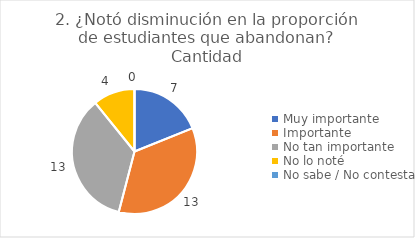
| Category | 2. ¿Notó disminución en la proporción de estudiantes que abandonan? |
|---|---|
| Muy importante  | 0.189 |
| Importante  | 0.351 |
| No tan importante  | 0.351 |
| No lo noté  | 0.108 |
| No sabe / No contesta | 0 |